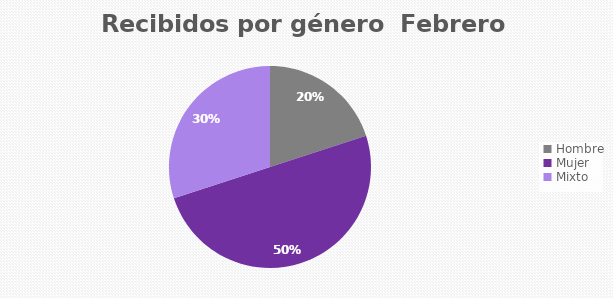
| Category | Recibidos por género  FEBRERO |
|---|---|
| Hombre | 2 |
| Mujer | 5 |
| Mixto | 3 |